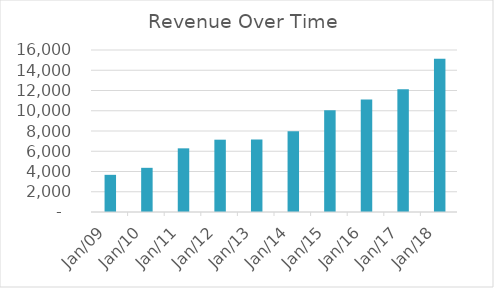
| Category | Revenue |
|---|---|
| Mar-09 | 3670.85 |
| Mar-10 | 4363.11 |
| Mar-11 | 6288.02 |
| Mar-12 | 7141.52 |
| Mar-13 | 7169.25 |
| Mar-14 | 7965.94 |
| Mar-15 | 10042.33 |
| Mar-16 | 11104.66 |
| Mar-17 | 12135.31 |
| Mar-18 | 15129.66 |